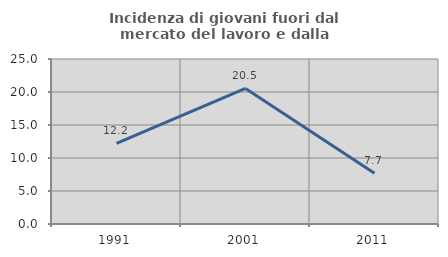
| Category | Incidenza di giovani fuori dal mercato del lavoro e dalla formazione  |
|---|---|
| 1991.0 | 12.222 |
| 2001.0 | 20.548 |
| 2011.0 | 7.692 |